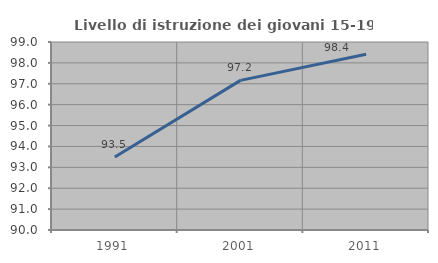
| Category | Livello di istruzione dei giovani 15-19 anni |
|---|---|
| 1991.0 | 93.491 |
| 2001.0 | 97.163 |
| 2011.0 | 98.413 |